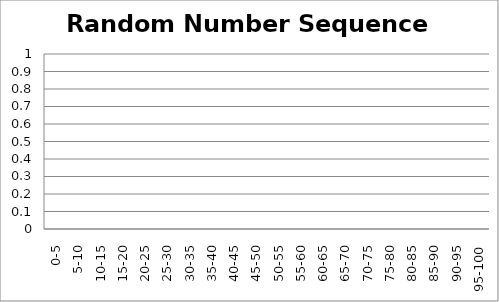
| Category | Random Number Sequence #1 |
|---|---|
| 0-5 | 0 |
| 5-10 | 0 |
| 10-15 | 0 |
| 15-20 | 0 |
| 20-25 | 0 |
| 25-30 | 0 |
| 30-35 | 0 |
| 35-40 | 0 |
| 40-45 | 0 |
| 45-50 | 0 |
| 50-55 | 0 |
| 55-60 | 0 |
| 60-65 | 0 |
| 65-70 | 0 |
| 70-75 | 0 |
| 75-80 | 0 |
| 80-85 | 0 |
| 85-90 | 0 |
| 90-95 | 0 |
| 95-100 | 0 |